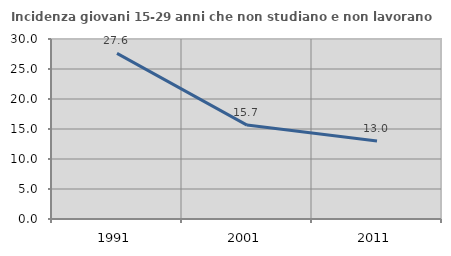
| Category | Incidenza giovani 15-29 anni che non studiano e non lavorano  |
|---|---|
| 1991.0 | 27.607 |
| 2001.0 | 15.652 |
| 2011.0 | 13.004 |